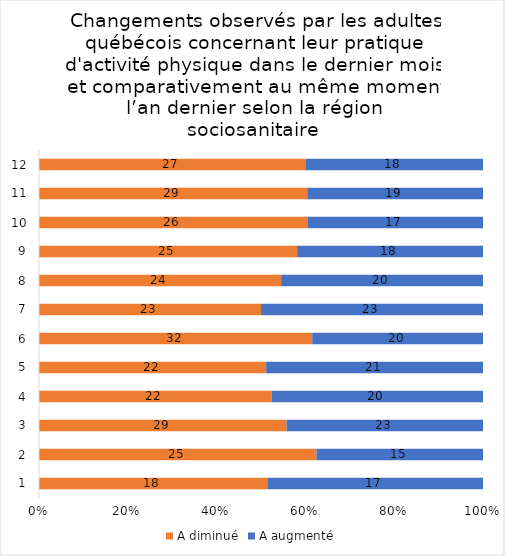
| Category | A diminué | A augmenté |
|---|---|---|
| 0 | 18 | 17 |
| 1 | 25 | 15 |
| 2 | 29 | 23 |
| 3 | 22 | 20 |
| 4 | 22 | 21 |
| 5 | 32 | 20 |
| 6 | 23 | 23 |
| 7 | 24 | 20 |
| 8 | 25 | 18 |
| 9 | 26 | 17 |
| 10 | 29 | 19 |
| 11 | 27 | 18 |